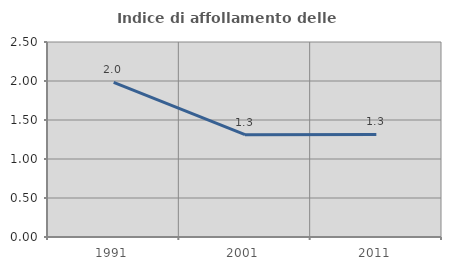
| Category | Indice di affollamento delle abitazioni  |
|---|---|
| 1991.0 | 1.982 |
| 2001.0 | 1.312 |
| 2011.0 | 1.315 |